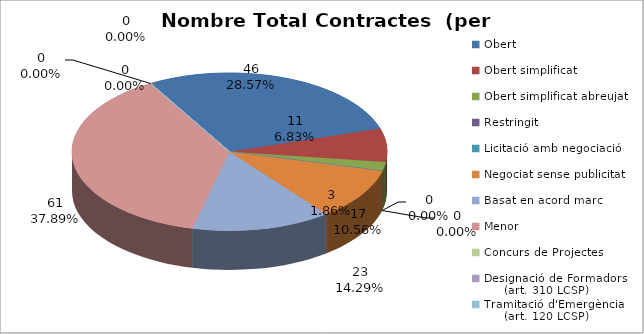
| Category | Nombre Total Contractes |
|---|---|
| Obert | 46 |
| Obert simplificat | 11 |
| Obert simplificat abreujat | 3 |
| Restringit | 0 |
| Licitació amb negociació | 0 |
| Negociat sense publicitat | 17 |
| Basat en acord marc | 23 |
| Menor | 61 |
| Concurs de Projectes | 0 |
| Designació de Formadors
     (art. 310 LCSP) | 0 |
| Tramitació d'Emergència
     (art. 120 LCSP) | 0 |